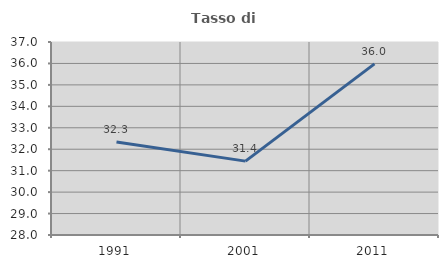
| Category | Tasso di occupazione   |
|---|---|
| 1991.0 | 32.341 |
| 2001.0 | 31.445 |
| 2011.0 | 35.982 |